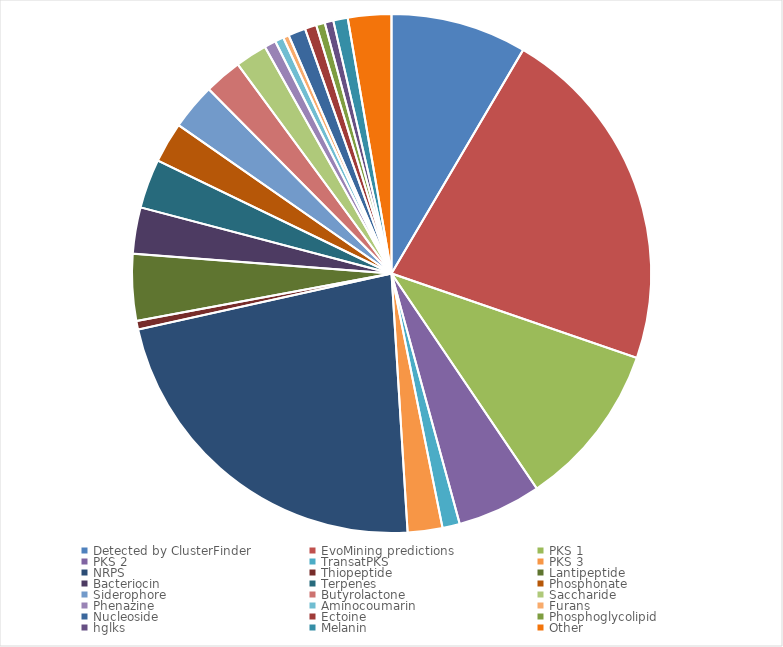
| Category | Series 0 |
|---|---|
| Detected by ClusterFinder | 47 |
| EvoMining predictions | 121 |
| PKS 1 | 57 |
| PKS 2 | 29 |
| TransatPKS | 6 |
| PKS 3 | 12 |
| NRPS | 125 |
| Thiopeptide | 3 |
| Lantipeptide | 23 |
| Bacteriocin | 16 |
| Terpenes | 17 |
| Phosphonate | 14 |
| Siderophore | 16 |
| Butyrolactone | 13 |
| Saccharide | 11 |
| Phenazine | 4 |
| Aminocoumarin | 3 |
| Furans | 2 |
| Nucleoside | 6 |
| Ectoine | 4 |
| Phosphoglycolipid | 3 |
| hglks | 3 |
| Melanin | 5 |
| Other | 15 |